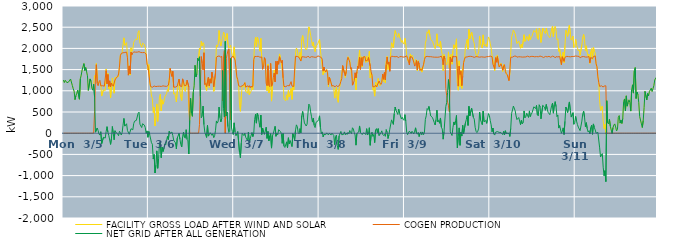
| Category | FACILITY GROSS LOAD AFTER WIND AND SOLAR | COGEN PRODUCTION | NET GRID AFTER ALL GENERATION |
|---|---|---|---|
|  Mon  3/5 | 1253 | 0 | 1253 |
|  Mon  3/5 | 1195 | 0 | 1195 |
|  Mon  3/5 | 1247 | 0 | 1247 |
|  Mon  3/5 | 1238 | 0 | 1238 |
|  Mon  3/5 | 1190 | 0 | 1190 |
|  Mon  3/5 | 1207 | 0 | 1207 |
|  Mon  3/5 | 1213 | 0 | 1213 |
|  Mon  3/5 | 1229 | 0 | 1229 |
|  Mon  3/5 | 1278 | 0 | 1278 |
|  Mon  3/5 | 1283 | 0 | 1283 |
|  Mon  3/5 | 1126 | 0 | 1126 |
|  Mon  3/5 | 1049 | 0 | 1049 |
|  Mon  3/5 | 991 | 0 | 991 |
|  Mon  3/5 | 792 | 0 | 792 |
|  Mon  3/5 | 884 | 0 | 884 |
|  Mon  3/5 | 943 | 0 | 943 |
|  Mon  3/5 | 1016 | 0 | 1016 |
|  Mon  3/5 | 1018 | 0 | 1018 |
|  Mon  3/5 | 802 | 0 | 802 |
|  Mon  3/5 | 1283 | 0 | 1283 |
|  Mon  3/5 | 1369 | 0 | 1369 |
|  Mon  3/5 | 1489 | 0 | 1489 |
|  Mon  3/5 | 1570 | 0 | 1570 |
|  Mon  3/5 | 1641 | 0 | 1641 |
|  Mon  3/5 | 1480 | 0 | 1480 |
|  Mon  3/5 | 1547 | 0 | 1547 |
|  Mon  3/5 | 1452 | 0 | 1452 |
|  Mon  3/5 | 1353 | 0 | 1353 |
|  Mon  3/5 | 1011 | 0 | 1011 |
|  Mon  3/5 | 1025 | 0 | 1025 |
|  Mon  3/5 | 1280 | 0 | 1280 |
|  Mon  3/5 | 1225 | 0 | 1225 |
|  Mon  3/5 | 1063 | 0 | 1063 |
|  Mon  3/5 | 1015 | 0 | 1015 |
|  Mon  3/5 | 1155 | 0 | 1155 |
|  Mon  3/5 | 1363 | 510 | 853 |
|  Mon  3/5 | 1325 | 1302 | 23 |
|  Mon  3/5 | 1645 | 1615 | 30 |
|  Mon  3/5 | 1294 | 1171 | 123 |
|  Mon  3/5 | 1180 | 1119 | 61 |
|  Mon  3/5 | 1193 | 1212 | -19 |
|  Mon  3/5 | 1201 | 1246 | -45 |
|  Mon  3/5 | 1150 | 1115 | 35 |
|  Mon  3/5 | 876 | 1123 | -247 |
|  Mon  3/5 | 882 | 1120 | -238 |
|  Mon  3/5 | 1024 | 1121 | -97 |
|  Mon  3/5 | 1033 | 1109 | -76 |
|  Mon  3/5 | 1005 | 1120 | -115 |
|  Mon  3/5 | 1515 | 1476 | 39 |
|  Mon  3/5 | 1317 | 1163 | 154 |
|  Mon  3/5 | 1409 | 1385 | 24 |
|  Mon  3/5 | 1049 | 1103 | -54 |
|  Mon  3/5 | 1187 | 1235 | -48 |
|  Mon  3/5 | 834 | 1098 | -264 |
|  Mon  3/5 | 1063 | 1183 | -120 |
|  Mon  3/5 | 1299 | 1141 | 158 |
|  Mon  3/5 | 1103 | 1107 | -4 |
|  Mon  3/5 | 943 | 1098 | -155 |
|  Mon  3/5 | 1314 | 1255 | 59 |
|  Mon  3/5 | 1313 | 1295 | 18 |
|  Mon  3/5 | 1324 | 1293 | 31 |
|  Mon  3/5 | 1321 | 1336 | -15 |
|  Mon  3/5 | 1337 | 1397 | -60 |
|  Mon  3/5 | 1604 | 1557 | 47 |
|  Mon  3/5 | 1840 | 1826 | 14 |
|  Mon  3/5 | 1839 | 1882 | -43 |
|  Mon  3/5 | 1905 | 1889 | 16 |
|  Mon  3/5 | 2084 | 1897 | 187 |
|  Mon  3/5 | 2249 | 1901 | 348 |
|  Mon  3/5 | 2070 | 1903 | 167 |
|  Mon  3/5 | 2073 | 1909 | 164 |
|  Mon  3/5 | 2136 | 1913 | 223 |
|  Mon  3/5 | 1841 | 1778 | 63 |
|  Mon  3/5 | 1454 | 1368 | 86 |
|  Mon  3/5 | 1562 | 1587 | -25 |
|  Mon  3/5 | 1371 | 1399 | -28 |
|  Mon  3/5 | 2015 | 1910 | 105 |
|  Mon  3/5 | 1931 | 1849 | 82 |
|  Mon  3/5 | 1974 | 1894 | 80 |
|  Mon  3/5 | 2143 | 1918 | 225 |
|  Mon  3/5 | 2181 | 1897 | 284 |
|  Mon  3/5 | 2215 | 1911 | 304 |
|  Mon  3/5 | 2206 | 1903 | 303 |
|  Mon  3/5 | 2212 | 1912 | 300 |
|  Mon  3/5 | 2379 | 1909 | 470 |
|  Mon  3/5 | 2419 | 1923 | 496 |
|  Mon  3/5 | 2127 | 1914 | 213 |
|  Mon  3/5 | 2130 | 1903 | 227 |
|  Mon  3/5 | 2029 | 1896 | 133 |
|  Mon  3/5 | 2123 | 1900 | 223 |
|  Mon  3/5 | 2129 | 1903 | 226 |
|  Mon  3/5 | 2094 | 1904 | 190 |
|  Mon  3/5 | 2021 | 1888 | 133 |
|  Mon  3/5 | 1868 | 1869 | -1 |
|  Mon  3/5 | 1678 | 1624 | 54 |
|  Mon  3/5 | 1491 | 1587 | -96 |
|  Tue  3/6 | 1619 | 1579 | 40 |
|  Tue  3/6 | 1198 | 1232 | -34 |
|  Tue  3/6 | 1084 | 1101 | -17 |
|  Tue  3/6 | 875 | 1100 | -225 |
|  Tue  3/6 | 823 | 1083 | -260 |
|  Tue  3/6 | 487 | 1096 | -609 |
|  Tue  3/6 | 612 | 1114 | -502 |
|  Tue  3/6 | 170 | 1109 | -939 |
|  Tue  3/6 | 346 | 1099 | -753 |
|  Tue  3/6 | 690 | 1106 | -416 |
|  Tue  3/6 | 279 | 1107 | -828 |
|  Tue  3/6 | 508 | 1109 | -601 |
|  Tue  3/6 | 857 | 1108 | -251 |
|  Tue  3/6 | 921 | 1130 | -209 |
|  Tue  3/6 | 525 | 1103 | -578 |
|  Tue  3/6 | 790 | 1117 | -327 |
|  Tue  3/6 | 685 | 1117 | -432 |
|  Tue  3/6 | 747 | 1106 | -359 |
|  Tue  3/6 | 855 | 1108 | -253 |
|  Tue  3/6 | 840 | 1119 | -279 |
|  Tue  3/6 | 932 | 1104 | -172 |
|  Tue  3/6 | 1032 | 1109 | -77 |
|  Tue  3/6 | 983 | 1132 | -149 |
|  Tue  3/6 | 1292 | 1248 | 44 |
|  Tue  3/6 | 1526 | 1531 | -5 |
|  Tue  3/6 | 1427 | 1428 | -1 |
|  Tue  3/6 | 1365 | 1337 | 28 |
|  Tue  3/6 | 1403 | 1460 | -57 |
|  Tue  3/6 | 920 | 1086 | -166 |
|  Tue  3/6 | 950 | 1101 | -151 |
|  Tue  3/6 | 859 | 1087 | -228 |
|  Tue  3/6 | 736 | 1109 | -373 |
|  Tue  3/6 | 992 | 1108 | -116 |
|  Tue  3/6 | 1007 | 1107 | -100 |
|  Tue  3/6 | 1273 | 1275 | -2 |
|  Tue  3/6 | 975 | 1117 | -142 |
|  Tue  3/6 | 839 | 1108 | -269 |
|  Tue  3/6 | 771 | 1096 | -325 |
|  Tue  3/6 | 1196 | 1282 | -86 |
|  Tue  3/6 | 1235 | 1210 | 25 |
|  Tue  3/6 | 1027 | 1119 | -92 |
|  Tue  3/6 | 982 | 1100 | -118 |
|  Tue  3/6 | 1213 | 1130 | 83 |
|  Tue  3/6 | 1108 | 1252 | -144 |
|  Tue  3/6 | 1083 | 1263 | -180 |
|  Tue  3/6 | 600 | 1091 | -491 |
|  Tue  3/6 | 304 | 0 | 304 |
|  Tue  3/6 | 822 | 0 | 822 |
|  Tue  3/6 | 468 | 0 | 468 |
|  Tue  3/6 | 398 | 0 | 398 |
|  Tue  3/6 | 966 | 0 | 966 |
|  Tue  3/6 | 1117 | 0 | 1117 |
|  Tue  3/6 | 1601 | 0 | 1601 |
|  Tue  3/6 | 1327 | 0 | 1327 |
|  Tue  3/6 | 1396 | 0 | 1396 |
|  Tue  3/6 | 1767 | 0 | 1767 |
|  Tue  3/6 | 1714 | 0 | 1714 |
|  Tue  3/6 | 2004 | 202 | 1802 |
|  Tue  3/6 | 1967 | 1101 | 866 |
|  Tue  3/6 | 2170 | 1807 | 363 |
|  Tue  3/6 | 2060 | 1658 | 402 |
|  Tue  3/6 | 2134 | 1494 | 640 |
|  Tue  3/6 | 2099 | 1897 | 202 |
|  Tue  3/6 | 1167 | 1147 | 20 |
|  Tue  3/6 | 1181 | 1174 | 7 |
|  Tue  3/6 | 1000 | 1101 | -101 |
|  Tue  3/6 | 1288 | 1104 | 184 |
|  Tue  3/6 | 1249 | 1318 | -69 |
|  Tue  3/6 | 1077 | 1114 | -37 |
|  Tue  3/6 | 1293 | 1281 | 12 |
|  Tue  3/6 | 1214 | 1180 | 34 |
|  Tue  3/6 | 1389 | 1440 | -51 |
|  Tue  3/6 | 1297 | 1308 | -11 |
|  Tue  3/6 | 987 | 1093 | -106 |
|  Tue  3/6 | 1036 | 1097 | -61 |
|  Tue  3/6 | 1487 | 1420 | 67 |
|  Tue  3/6 | 2081 | 1792 | 289 |
|  Tue  3/6 | 2036 | 1798 | 238 |
|  Tue  3/6 | 2099 | 1818 | 281 |
|  Tue  3/6 | 2422 | 1807 | 615 |
|  Tue  3/6 | 2179 | 1815 | 364 |
|  Tue  3/6 | 2055 | 1789 | 266 |
|  Tue  3/6 | 2163 | 1816 | 347 |
|  Tue  3/6 | 2238 | 761 | 1477 |
|  Tue  3/6 | 2382 | 1798 | 584 |
|  Tue  3/6 | 2329 | 1949 | 380 |
|  Tue  3/6 | 2166 | 0 | 2166 |
|  Tue  3/6 | 2157 | 1751 | 406 |
|  Tue  3/6 | 2349 | 1854 | 495 |
|  Tue  3/6 | 2102 | 1948 | 154 |
|  Tue  3/6 | 2008 | 1990 | 18 |
|  Tue  3/6 | 2038 | 1996 | 42 |
|  Tue  3/6 | 2078 | 316 | 1762 |
|  Tue  3/6 | 1924 | 1796 | 128 |
|  Tue  3/6 | 1829 | 1787 | 42 |
|  Tue  3/6 | 1780 | 1811 | -31 |
|  Wed  3/7 | 2037 | 1793 | 244 |
|  Wed  3/7 | 1749 | 1726 | 23 |
|  Wed  3/7 | 1484 | 1545 | -61 |
|  Wed  3/7 | 1291 | 1329 | -38 |
|  Wed  3/7 | 1303 | 1264 | 39 |
|  Wed  3/7 | 1152 | 1121 | 31 |
|  Wed  3/7 | 658 | 1106 | -448 |
|  Wed  3/7 | 516 | 1097 | -581 |
|  Wed  3/7 | 872 | 1105 | -233 |
|  Wed  3/7 | 1115 | 1117 | -2 |
|  Wed  3/7 | 1097 | 1118 | -21 |
|  Wed  3/7 | 1089 | 1146 | -57 |
|  Wed  3/7 | 1194 | 1192 | 2 |
|  Wed  3/7 | 986 | 1084 | -98 |
|  Wed  3/7 | 1009 | 1098 | -89 |
|  Wed  3/7 | 945 | 1120 | -175 |
|  Wed  3/7 | 1113 | 1087 | 26 |
|  Wed  3/7 | 901 | 1122 | -221 |
|  Wed  3/7 | 945 | 1071 | -126 |
|  Wed  3/7 | 990 | 1112 | -122 |
|  Wed  3/7 | 1097 | 1083 | 14 |
|  Wed  3/7 | 1031 | 1110 | -79 |
|  Wed  3/7 | 1727 | 1733 | -6 |
|  Wed  3/7 | 2133 | 1811 | 322 |
|  Wed  3/7 | 2259 | 1811 | 448 |
|  Wed  3/7 | 2045 | 1808 | 237 |
|  Wed  3/7 | 2266 | 1797 | 469 |
|  Wed  3/7 | 2221 | 1814 | 407 |
|  Wed  3/7 | 2066 | 1811 | 255 |
|  Wed  3/7 | 1933 | 1792 | 141 |
|  Wed  3/7 | 2235 | 1809 | 426 |
|  Wed  3/7 | 1767 | 1797 | -30 |
|  Wed  3/7 | 1626 | 1505 | 121 |
|  Wed  3/7 | 1580 | 1548 | 32 |
|  Wed  3/7 | 1754 | 1782 | -28 |
|  Wed  3/7 | 1722 | 1732 | -10 |
|  Wed  3/7 | 1318 | 1177 | 141 |
|  Wed  3/7 | 999 | 1122 | -123 |
|  Wed  3/7 | 1632 | 1590 | 42 |
|  Wed  3/7 | 947 | 1129 | -182 |
|  Wed  3/7 | 1032 | 1098 | -66 |
|  Wed  3/7 | 1637 | 1646 | -9 |
|  Wed  3/7 | 757 | 1109 | -352 |
|  Wed  3/7 | 1090 | 1155 | -65 |
|  Wed  3/7 | 1303 | 1311 | -8 |
|  Wed  3/7 | 1492 | 1418 | 74 |
|  Wed  3/7 | 1373 | 1211 | 162 |
|  Wed  3/7 | 1623 | 1696 | -73 |
|  Wed  3/7 | 1389 | 1394 | -5 |
|  Wed  3/7 | 1661 | 1698 | -37 |
|  Wed  3/7 | 1709 | 1626 | 83 |
|  Wed  3/7 | 1870 | 1803 | 67 |
|  Wed  3/7 | 1770 | 1731 | 39 |
|  Wed  3/7 | 1655 | 1658 | -3 |
|  Wed  3/7 | 1482 | 1721 | -239 |
|  Wed  3/7 | 1298 | 1305 | -7 |
|  Wed  3/7 | 801 | 1105 | -304 |
|  Wed  3/7 | 785 | 1121 | -336 |
|  Wed  3/7 | 765 | 1097 | -332 |
|  Wed  3/7 | 903 | 1107 | -204 |
|  Wed  3/7 | 781 | 1124 | -343 |
|  Wed  3/7 | 1009 | 1116 | -107 |
|  Wed  3/7 | 862 | 1116 | -254 |
|  Wed  3/7 | 930 | 1105 | -175 |
|  Wed  3/7 | 1058 | 1216 | -158 |
|  Wed  3/7 | 797 | 1112 | -315 |
|  Wed  3/7 | 1109 | 1120 | -11 |
|  Wed  3/7 | 1017 | 1102 | -85 |
|  Wed  3/7 | 1350 | 1510 | -160 |
|  Wed  3/7 | 1891 | 1813 | 78 |
|  Wed  3/7 | 2009 | 1812 | 197 |
|  Wed  3/7 | 1966 | 1810 | 156 |
|  Wed  3/7 | 1809 | 1797 | 12 |
|  Wed  3/7 | 1777 | 1789 | -12 |
|  Wed  3/7 | 1907 | 1799 | 108 |
|  Wed  3/7 | 1711 | 1701 | 10 |
|  Wed  3/7 | 2216 | 1802 | 414 |
|  Wed  3/7 | 2303 | 1790 | 513 |
|  Wed  3/7 | 2172 | 1801 | 371 |
|  Wed  3/7 | 2035 | 1793 | 242 |
|  Wed  3/7 | 2027 | 1792 | 235 |
|  Wed  3/7 | 1963 | 1793 | 170 |
|  Wed  3/7 | 2007 | 1793 | 214 |
|  Wed  3/7 | 2289 | 1817 | 472 |
|  Wed  3/7 | 2508 | 1822 | 686 |
|  Wed  3/7 | 2434 | 1783 | 651 |
|  Wed  3/7 | 2307 | 1804 | 503 |
|  Wed  3/7 | 2191 | 1805 | 386 |
|  Wed  3/7 | 2060 | 1798 | 262 |
|  Wed  3/7 | 2151 | 1798 | 353 |
|  Wed  3/7 | 2000 | 1815 | 185 |
|  Wed  3/7 | 1923 | 1790 | 133 |
|  Wed  3/7 | 2054 | 1799 | 255 |
|  Wed  3/7 | 2042 | 1795 | 247 |
|  Wed  3/7 | 2110 | 1825 | 285 |
|  Wed  3/7 | 2122 | 1802 | 320 |
|  Thu  3/8 | 2216 | 1807 | 409 |
|  Thu  3/8 | 1948 | 1805 | 143 |
|  Thu  3/8 | 1771 | 1784 | -13 |
|  Thu  3/8 | 1776 | 1745 | 31 |
|  Thu  3/8 | 1377 | 1464 | -87 |
|  Thu  3/8 | 1534 | 1561 | -27 |
|  Thu  3/8 | 1426 | 1476 | -50 |
|  Thu  3/8 | 1413 | 1447 | -34 |
|  Thu  3/8 | 1504 | 1497 | 7 |
|  Thu  3/8 | 1416 | 1424 | -8 |
|  Thu  3/8 | 1097 | 1138 | -41 |
|  Thu  3/8 | 1315 | 1316 | -1 |
|  Thu  3/8 | 1255 | 1266 | -11 |
|  Thu  3/8 | 1249 | 1289 | -40 |
|  Thu  3/8 | 1105 | 1106 | -1 |
|  Thu  3/8 | 1125 | 1133 | -8 |
|  Thu  3/8 | 1053 | 1106 | -53 |
|  Thu  3/8 | 828 | 1098 | -270 |
|  Thu  3/8 | 1014 | 1100 | -86 |
|  Thu  3/8 | 1083 | 1126 | -43 |
|  Thu  3/8 | 811 | 1102 | -291 |
|  Thu  3/8 | 728 | 1110 | -382 |
|  Thu  3/8 | 1049 | 1114 | -65 |
|  Thu  3/8 | 1108 | 1159 | -51 |
|  Thu  3/8 | 1264 | 1222 | 42 |
|  Thu  3/8 | 1253 | 1290 | -37 |
|  Thu  3/8 | 1580 | 1596 | -16 |
|  Thu  3/8 | 1573 | 1601 | -28 |
|  Thu  3/8 | 1448 | 1417 | 31 |
|  Thu  3/8 | 1314 | 1351 | -37 |
|  Thu  3/8 | 1463 | 1458 | 5 |
|  Thu  3/8 | 1685 | 1715 | -30 |
|  Thu  3/8 | 1808 | 1790 | 18 |
|  Thu  3/8 | 1771 | 1785 | -14 |
|  Thu  3/8 | 1739 | 1676 | 63 |
|  Thu  3/8 | 1528 | 1512 | 16 |
|  Thu  3/8 | 1535 | 1547 | -12 |
|  Thu  3/8 | 1261 | 1133 | 128 |
|  Thu  3/8 | 1277 | 1179 | 98 |
|  Thu  3/8 | 1256 | 1239 | 17 |
|  Thu  3/8 | 1383 | 1425 | -42 |
|  Thu  3/8 | 1022 | 1304 | -282 |
|  Thu  3/8 | 1440 | 1445 | -5 |
|  Thu  3/8 | 1565 | 1585 | -20 |
|  Thu  3/8 | 1554 | 1529 | 25 |
|  Thu  3/8 | 1959 | 1788 | 171 |
|  Thu  3/8 | 1519 | 1505 | 14 |
|  Thu  3/8 | 1803 | 1779 | 24 |
|  Thu  3/8 | 1566 | 1598 | -32 |
|  Thu  3/8 | 1802 | 1796 | 6 |
|  Thu  3/8 | 1785 | 1795 | -10 |
|  Thu  3/8 | 1800 | 1807 | -7 |
|  Thu  3/8 | 1669 | 1702 | -33 |
|  Thu  3/8 | 1822 | 1715 | 107 |
|  Thu  3/8 | 1676 | 1719 | -43 |
|  Thu  3/8 | 1770 | 1786 | -16 |
|  Thu  3/8 | 1931 | 1802 | 129 |
|  Thu  3/8 | 1302 | 1587 | -285 |
|  Thu  3/8 | 1411 | 1449 | -38 |
|  Thu  3/8 | 1387 | 1362 | 25 |
|  Thu  3/8 | 1017 | 1094 | -77 |
|  Thu  3/8 | 1073 | 1103 | -30 |
|  Thu  3/8 | 874 | 1097 | -223 |
|  Thu  3/8 | 1204 | 1130 | 74 |
|  Thu  3/8 | 1198 | 1090 | 108 |
|  Thu  3/8 | 1104 | 1092 | 12 |
|  Thu  3/8 | 1289 | 1182 | 107 |
|  Thu  3/8 | 1175 | 1231 | -56 |
|  Thu  3/8 | 1116 | 1181 | -65 |
|  Thu  3/8 | 1157 | 1151 | 6 |
|  Thu  3/8 | 1253 | 1197 | 56 |
|  Thu  3/8 | 1365 | 1392 | -27 |
|  Thu  3/8 | 1219 | 1273 | -54 |
|  Thu  3/8 | 1405 | 1431 | -26 |
|  Thu  3/8 | 1183 | 1258 | -75 |
|  Thu  3/8 | 1700 | 1615 | 85 |
|  Thu  3/8 | 1813 | 1796 | 17 |
|  Thu  3/8 | 1501 | 1627 | -126 |
|  Thu  3/8 | 1643 | 1678 | -35 |
|  Thu  3/8 | 1555 | 1461 | 94 |
|  Thu  3/8 | 1888 | 1794 | 94 |
|  Thu  3/8 | 2133 | 1818 | 315 |
|  Thu  3/8 | 2119 | 1795 | 324 |
|  Thu  3/8 | 2016 | 1808 | 208 |
|  Thu  3/8 | 2267 | 1806 | 461 |
|  Thu  3/8 | 2420 | 1803 | 617 |
|  Thu  3/8 | 2346 | 1804 | 542 |
|  Thu  3/8 | 2340 | 1809 | 531 |
|  Thu  3/8 | 2260 | 1819 | 441 |
|  Thu  3/8 | 2350 | 1781 | 569 |
|  Thu  3/8 | 2271 | 1805 | 466 |
|  Thu  3/8 | 2221 | 1814 | 407 |
|  Thu  3/8 | 2143 | 1808 | 335 |
|  Thu  3/8 | 2189 | 1814 | 375 |
|  Thu  3/8 | 2124 | 1794 | 330 |
|  Thu  3/8 | 2100 | 1797 | 303 |
|  Fri  3/9 | 2238 | 1801 | 437 |
|  Fri  3/9 | 2087 | 1804 | 283 |
|  Fri  3/9 | 1849 | 1824 | 25 |
|  Fri  3/9 | 1729 | 1764 | -35 |
|  Fri  3/9 | 1671 | 1699 | -28 |
|  Fri  3/9 | 1660 | 1611 | 49 |
|  Fri  3/9 | 1870 | 1805 | 65 |
|  Fri  3/9 | 1783 | 1789 | -6 |
|  Fri  3/9 | 1841 | 1796 | 45 |
|  Fri  3/9 | 1812 | 1786 | 26 |
|  Fri  3/9 | 1659 | 1677 | -18 |
|  Fri  3/9 | 1630 | 1582 | 48 |
|  Fri  3/9 | 1746 | 1619 | 127 |
|  Fri  3/9 | 1715 | 1715 | 0 |
|  Fri  3/9 | 1467 | 1491 | -24 |
|  Fri  3/9 | 1710 | 1690 | 20 |
|  Fri  3/9 | 1551 | 1631 | -80 |
|  Fri  3/9 | 1476 | 1479 | -3 |
|  Fri  3/9 | 1541 | 1510 | 31 |
|  Fri  3/9 | 1441 | 1480 | -39 |
|  Fri  3/9 | 1524 | 1494 | 30 |
|  Fri  3/9 | 1591 | 1626 | -35 |
|  Fri  3/9 | 1763 | 1734 | 29 |
|  Fri  3/9 | 2124 | 1800 | 324 |
|  Fri  3/9 | 2205 | 1794 | 411 |
|  Fri  3/9 | 2393 | 1812 | 581 |
|  Fri  3/9 | 2352 | 1796 | 556 |
|  Fri  3/9 | 2437 | 1805 | 632 |
|  Fri  3/9 | 2320 | 1800 | 520 |
|  Fri  3/9 | 2212 | 1805 | 407 |
|  Fri  3/9 | 2197 | 1790 | 407 |
|  Fri  3/9 | 2168 | 1798 | 370 |
|  Fri  3/9 | 2191 | 1812 | 379 |
|  Fri  3/9 | 2045 | 1793 | 252 |
|  Fri  3/9 | 1994 | 1799 | 195 |
|  Fri  3/9 | 2115 | 1793 | 322 |
|  Fri  3/9 | 2344 | 1800 | 544 |
|  Fri  3/9 | 2056 | 1791 | 265 |
|  Fri  3/9 | 2091 | 1789 | 302 |
|  Fri  3/9 | 2033 | 1799 | 234 |
|  Fri  3/9 | 2169 | 1810 | 359 |
|  Fri  3/9 | 1959 | 1818 | 141 |
|  Fri  3/9 | 1854 | 1756 | 98 |
|  Fri  3/9 | 1473 | 1614 | -141 |
|  Fri  3/9 | 1854 | 1817 | 37 |
|  Fri  3/9 | 1805 | 1748 | 57 |
|  Fri  3/9 | 1682 | 1055 | 627 |
|  Fri  3/9 | 1610 | 883 | 727 |
|  Fri  3/9 | 1692 | 731 | 961 |
|  Fri  3/9 | 1917 | 653 | 1264 |
|  Fri  3/9 | 1537 | 509 | 1028 |
|  Fri  3/9 | 1826 | 1795 | 31 |
|  Fri  3/9 | 1861 | 1809 | 52 |
|  Fri  3/9 | 1626 | 1681 | -55 |
|  Fri  3/9 | 1949 | 1817 | 132 |
|  Fri  3/9 | 2086 | 1821 | 265 |
|  Fri  3/9 | 2000 | 1804 | 196 |
|  Fri  3/9 | 2094 | 1800 | 294 |
|  Fri  3/9 | 2226 | 1807 | 419 |
|  Fri  3/9 | 1184 | 1530 | -346 |
|  Fri  3/9 | 1014 | 1110 | -96 |
|  Fri  3/9 | 1707 | 1581 | 126 |
|  Fri  3/9 | 1100 | 1386 | -286 |
|  Fri  3/9 | 1480 | 1459 | 21 |
|  Fri  3/9 | 1056 | 1123 | -67 |
|  Fri  3/9 | 1530 | 1345 | 185 |
|  Fri  3/9 | 1658 | 1669 | -11 |
|  Fri  3/9 | 1715 | 1745 | -30 |
|  Fri  3/9 | 2032 | 1796 | 236 |
|  Fri  3/9 | 2124 | 1806 | 318 |
|  Fri  3/9 | 2213 | 1799 | 414 |
|  Fri  3/9 | 1979 | 1796 | 183 |
|  Fri  3/9 | 2447 | 1813 | 634 |
|  Fri  3/9 | 2227 | 1819 | 408 |
|  Fri  3/9 | 2216 | 1813 | 403 |
|  Fri  3/9 | 2385 | 1794 | 591 |
|  Fri  3/9 | 2383 | 1805 | 578 |
|  Fri  3/9 | 2182 | 1810 | 372 |
|  Fri  3/9 | 2119 | 1787 | 332 |
|  Fri  3/9 | 1945 | 1805 | 140 |
|  Fri  3/9 | 1853 | 1807 | 46 |
|  Fri  3/9 | 1803 | 1788 | 15 |
|  Fri  3/9 | 1848 | 1801 | 47 |
|  Fri  3/9 | 1925 | 1805 | 120 |
|  Fri  3/9 | 2293 | 1793 | 500 |
|  Fri  3/9 | 2129 | 1814 | 315 |
|  Fri  3/9 | 2056 | 1801 | 255 |
|  Fri  3/9 | 2008 | 1806 | 202 |
|  Fri  3/9 | 2319 | 1796 | 523 |
|  Fri  3/9 | 2087 | 1815 | 272 |
|  Fri  3/9 | 2056 | 1792 | 264 |
|  Fri  3/9 | 2093 | 1796 | 297 |
|  Fri  3/9 | 2036 | 1804 | 232 |
|  Fri  3/9 | 2158 | 1803 | 355 |
|  Fri  3/9 | 2270 | 1807 | 463 |
|  Fri  3/9 | 2218 | 1800 | 418 |
|  Sat  3/10 | 2113 | 1818 | 295 |
|  Sat  3/10 | 2008 | 1811 | 197 |
|  Sat  3/10 | 1837 | 1803 | 34 |
|  Sat  3/10 | 1748 | 1626 | 122 |
|  Sat  3/10 | 1595 | 1614 | -19 |
|  Sat  3/10 | 1473 | 1517 | -44 |
|  Sat  3/10 | 1803 | 1780 | 23 |
|  Sat  3/10 | 1686 | 1675 | 11 |
|  Sat  3/10 | 1845 | 1806 | 39 |
|  Sat  3/10 | 1697 | 1658 | 39 |
|  Sat  3/10 | 1579 | 1560 | 19 |
|  Sat  3/10 | 1592 | 1588 | 4 |
|  Sat  3/10 | 1654 | 1636 | 18 |
|  Sat  3/10 | 1576 | 1577 | -1 |
|  Sat  3/10 | 1454 | 1487 | -33 |
|  Sat  3/10 | 1622 | 1580 | 42 |
|  Sat  3/10 | 1576 | 1616 | -40 |
|  Sat  3/10 | 1511 | 1453 | 58 |
|  Sat  3/10 | 1391 | 1406 | -15 |
|  Sat  3/10 | 1392 | 1382 | 10 |
|  Sat  3/10 | 1343 | 1361 | -18 |
|  Sat  3/10 | 1249 | 1240 | 9 |
|  Sat  3/10 | 1410 | 1487 | -77 |
|  Sat  3/10 | 1903 | 1790 | 113 |
|  Sat  3/10 | 2270 | 1802 | 468 |
|  Sat  3/10 | 2343 | 1794 | 549 |
|  Sat  3/10 | 2434 | 1793 | 641 |
|  Sat  3/10 | 2448 | 1818 | 630 |
|  Sat  3/10 | 2342 | 1812 | 530 |
|  Sat  3/10 | 2227 | 1818 | 409 |
|  Sat  3/10 | 2114 | 1793 | 321 |
|  Sat  3/10 | 2148 | 1806 | 342 |
|  Sat  3/10 | 2172 | 1803 | 369 |
|  Sat  3/10 | 2087 | 1799 | 288 |
|  Sat  3/10 | 2003 | 1801 | 202 |
|  Sat  3/10 | 2102 | 1798 | 304 |
|  Sat  3/10 | 2017 | 1795 | 222 |
|  Sat  3/10 | 2032 | 1786 | 246 |
|  Sat  3/10 | 2322 | 1797 | 525 |
|  Sat  3/10 | 2164 | 1801 | 363 |
|  Sat  3/10 | 2189 | 1799 | 390 |
|  Sat  3/10 | 2289 | 1818 | 471 |
|  Sat  3/10 | 2288 | 1817 | 471 |
|  Sat  3/10 | 2180 | 1810 | 370 |
|  Sat  3/10 | 2324 | 1798 | 526 |
|  Sat  3/10 | 2205 | 1815 | 390 |
|  Sat  3/10 | 2252 | 1811 | 441 |
|  Sat  3/10 | 2289 | 1805 | 484 |
|  Sat  3/10 | 2363 | 1811 | 552 |
|  Sat  3/10 | 2423 | 1800 | 623 |
|  Sat  3/10 | 2406 | 1801 | 605 |
|  Sat  3/10 | 2378 | 1796 | 582 |
|  Sat  3/10 | 2462 | 1807 | 655 |
|  Sat  3/10 | 2239 | 1807 | 432 |
|  Sat  3/10 | 2210 | 1802 | 408 |
|  Sat  3/10 | 2478 | 1808 | 670 |
|  Sat  3/10 | 2444 | 1819 | 625 |
|  Sat  3/10 | 2140 | 1801 | 339 |
|  Sat  3/10 | 2149 | 1805 | 344 |
|  Sat  3/10 | 2475 | 1820 | 655 |
|  Sat  3/10 | 2425 | 1785 | 640 |
|  Sat  3/10 | 2408 | 1793 | 615 |
|  Sat  3/10 | 2351 | 1810 | 541 |
|  Sat  3/10 | 2481 | 1804 | 677 |
|  Sat  3/10 | 2373 | 1800 | 573 |
|  Sat  3/10 | 2308 | 1814 | 494 |
|  Sat  3/10 | 2286 | 1812 | 474 |
|  Sat  3/10 | 2253 | 1817 | 436 |
|  Sat  3/10 | 2340 | 1791 | 549 |
|  Sat  3/10 | 2460 | 1806 | 654 |
|  Sat  3/10 | 2525 | 1817 | 708 |
|  Sat  3/10 | 2274 | 1802 | 472 |
|  Sat  3/10 | 2471 | 1804 | 667 |
|  Sat  3/10 | 2521 | 1777 | 744 |
|  Sat  3/10 | 2432 | 1806 | 626 |
|  Sat  3/10 | 2202 | 1812 | 390 |
|  Sat  3/10 | 2228 | 1798 | 430 |
|  Sat  3/10 | 1931 | 1810 | 121 |
|  Sat  3/10 | 1991 | 1811 | 180 |
|  Sat  3/10 | 2000 | 1806 | 194 |
|  Sat  3/10 | 1615 | 1617 | -2 |
|  Sat  3/10 | 1854 | 1803 | 51 |
|  Sat  3/10 | 1912 | 1786 | 126 |
|  Sat  3/10 | 1664 | 1694 | -30 |
|  Sat  3/10 | 2072 | 1791 | 281 |
|  Sat  3/10 | 2428 | 1811 | 617 |
|  Sat  3/10 | 2365 | 1813 | 552 |
|  Sat  3/10 | 2283 | 1797 | 486 |
|  Sat  3/10 | 2293 | 1807 | 486 |
|  Sat  3/10 | 2547 | 1810 | 737 |
|  Sat  3/10 | 2340 | 1801 | 539 |
|  Sat  3/10 | 2195 | 1815 | 380 |
|  Sat  3/10 | 2191 | 1809 | 382 |
|  Sat  3/10 | 2286 | 1804 | 482 |
|  Sat  3/10 | 2019 | 1810 | 209 |
|  Sat  3/10 | 2043 | 1791 | 252 |
|  Sun  3/11 | 2216 | 1821 | 395 |
|  Sun  3/11 | 2084 | 1798 | 286 |
|  Sun  3/11 | 2021 | 1815 | 206 |
|  Sun  3/11 | 1943 | 1800 | 143 |
|  Sun  3/11 | 1971 | 1809 | 162 |
|  Sun  3/11 | 1837 | 1777 | 60 |
|  Sun  3/11 | 1860 | 1783 | 77 |
|  Sun  3/11 | 2090 | 1804 | 286 |
|  Sun  3/11 | 2262 | 1804 | 458 |
|  Sun  3/11 | 2328 | 1808 | 520 |
|  Sun  3/11 | 2207 | 1827 | 380 |
|  Sun  3/11 | 1949 | 1796 | 153 |
|  Sun  3/11 | 2060 | 1811 | 249 |
|  Sun  3/11 | 1903 | 1795 | 108 |
|  Sun  3/11 | 1819 | 1789 | 30 |
|  Sun  3/11 | 1866 | 1808 | 58 |
|  Sun  3/11 | 1646 | 1660 | -14 |
|  Sun  3/11 | 1916 | 1783 | 133 |
|  Sun  3/11 | 1995 | 1805 | 190 |
|  Sun  3/11 | 1736 | 1762 | -26 |
|  Sun  3/11 | 2026 | 1807 | 219 |
|  Sun  3/11 | 1936 | 1803 | 133 |
|  Sun  3/11 | 1902 | 1823 | 79 |
|  Sun  3/11 | 1639 | 1638 | 1 |
|  Sun  3/11 | 1559 | 1566 | -7 |
|  Sun  3/11 | 1348 | 1328 | 20 |
|  Sun  3/11 | 1192 | 1195 | -3 |
|  Sun  3/11 | 756 | 1102 | -346 |
|  Sun  3/11 | 531 | 1090 | -559 |
|  Sun  3/11 | 614 | 1119 | -505 |
|  Sun  3/11 | 642 | 1123 | -481 |
|  Sun  3/11 | 286 | 1088 | -802 |
|  Sun  3/11 | 109 | 1113 | -1004 |
|  Sun  3/11 | 208 | 1091 | -883 |
|  Sun  3/11 | -23 | 1118 | -1141 |
|  Sun  3/11 | 765 | 0 | 765 |
|  Sun  3/11 | 246 | 0 | 246 |
|  Sun  3/11 | 217 | 0 | 217 |
|  Sun  3/11 | 327 | 0 | 327 |
|  Sun  3/11 | 165 | 0 | 165 |
|  Sun  3/11 | 164 | 0 | 164 |
|  Sun  3/11 | -7 | 0 | -7 |
|  Sun  3/11 | 131 | 0 | 131 |
|  Sun  3/11 | 192 | 0 | 192 |
|  Sun  3/11 | 219 | 0 | 219 |
|  Sun  3/11 | 148 | 0 | 148 |
|  Sun  3/11 | 54 | 0 | 54 |
|  Sun  3/11 | 88 | 0 | 88 |
|  Sun  3/11 | 373 | 0 | 373 |
|  Sun  3/11 | 415 | 0 | 415 |
|  Sun  3/11 | 238 | 0 | 238 |
|  Sun  3/11 | 312 | 0 | 312 |
|  Sun  3/11 | 229 | 0 | 229 |
|  Sun  3/11 | 347 | 0 | 347 |
|  Sun  3/11 | 750 | 0 | 750 |
|  Sun  3/11 | 808 | 0 | 808 |
|  Sun  3/11 | 527 | 0 | 527 |
|  Sun  3/11 | 881 | 0 | 881 |
|  Sun  3/11 | 638 | 0 | 638 |
|  Sun  3/11 | 726 | 0 | 726 |
|  Sun  3/11 | 787 | 0 | 787 |
|  Sun  3/11 | 720 | 0 | 720 |
|  Sun  3/11 | 522 | 0 | 522 |
|  Sun  3/11 | 1021 | 0 | 1021 |
|  Sun  3/11 | 1141 | 0 | 1141 |
|  Sun  3/11 | 946 | 0 | 946 |
|  Sun  3/11 | 1469 | 0 | 1469 |
|  Sun  3/11 | 1548 | 0 | 1548 |
|  Sun  3/11 | 819 | 0 | 819 |
|  Sun  3/11 | 971 | 0 | 971 |
|  Sun  3/11 | 914 | 0 | 914 |
|  Sun  3/11 | 718 | 0 | 718 |
|  Sun  3/11 | 392 | 0 | 392 |
|  Sun  3/11 | 411 | 0 | 411 |
|  Sun  3/11 | 219 | 0 | 219 |
|  Sun  3/11 | 135 | 0 | 135 |
|  Sun  3/11 | 298 | 0 | 298 |
|  Sun  3/11 | 606 | 0 | 606 |
|  Sun  3/11 | 986 | 0 | 986 |
|  Sun  3/11 | 992 | 0 | 992 |
|  Sun  3/11 | 786 | 0 | 786 |
|  Sun  3/11 | 936 | 0 | 936 |
|  Sun  3/11 | 878 | 0 | 878 |
|  Sun  3/11 | 988 | 0 | 988 |
|  Sun  3/11 | 1018 | 0 | 1018 |
|  Sun  3/11 | 1061 | 0 | 1061 |
|  Sun  3/11 | 983 | 0 | 983 |
|  Sun  3/11 | 1050 | 0 | 1050 |
|  Sun  3/11 | 1122 | 0 | 1122 |
|  Sun  3/11 | 1257 | 0 | 1257 |
|  Sun  3/11 | 1242 | 0 | 1242 |
|  Sun  3/11 | 1324 | 0 | 1324 |